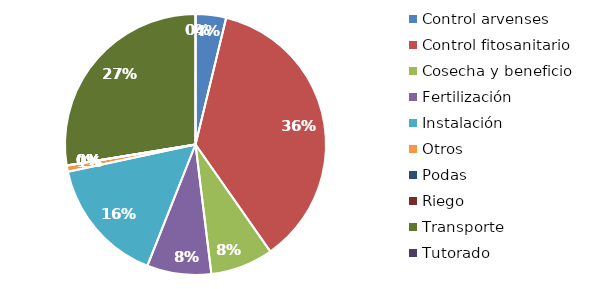
| Category | Valor |
|---|---|
| Control arvenses | 200400 |
| Control fitosanitario | 1935813 |
| Cosecha y beneficio | 411899.597 |
| Fertilización | 421944 |
| Instalación | 828947.939 |
| Otros | 41190 |
| Podas | 0 |
| Riego | 0 |
| Transporte | 1462238 |
| Tutorado | 0 |